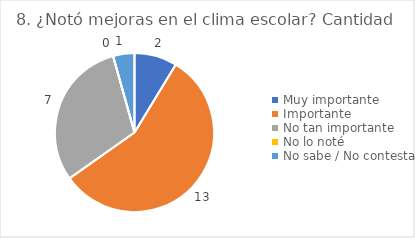
| Category | 8. ¿Notó mejoras en el clima escolar? |
|---|---|
| Muy importante  | 0.087 |
| Importante  | 0.565 |
| No tan importante  | 0.304 |
| No lo noté  | 0 |
| No sabe / No contesta | 0.043 |